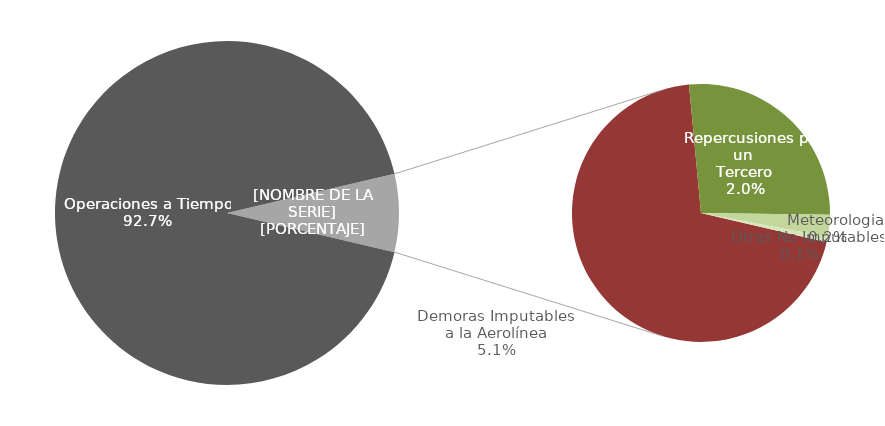
| Category | Demoras |
|---|---|
| Operaciones a Tiempo | 1852 |
| Demoras Imputables 
a la Aerolínea | 102 |
|    Aplicación de Control 
de Flujo | 0 |
|    Repercusiones por un 
Tercero | 39 |
|    Meteorologia | 4 |
|    Otras No Imputables | 1 |